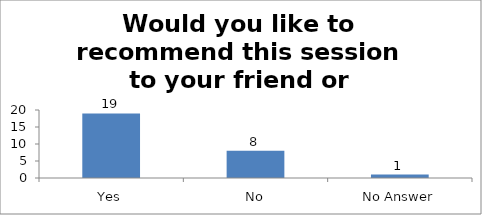
| Category | Would you like to recommend this session to your friend or colleague? |
|---|---|
| Yes | 19 |
| No | 8 |
| No Answer | 1 |